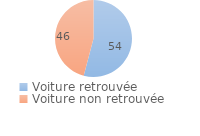
| Category | Series 0 |
|---|---|
| Voiture retrouvée | 54.108 |
| Voiture non retrouvée | 45.892 |